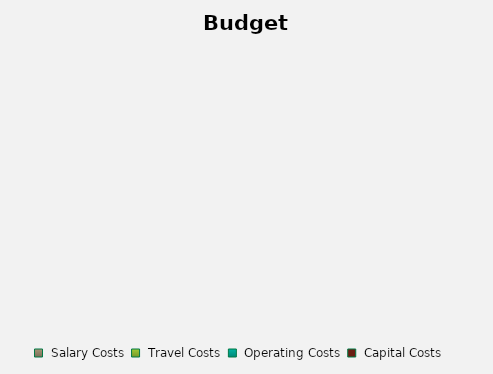
| Category | Series 0 |
|---|---|
|  Salary Costs  | 0 |
|  Travel Costs  | 0 |
|  Operating Costs  | 0 |
|  Capital Costs  | 0 |